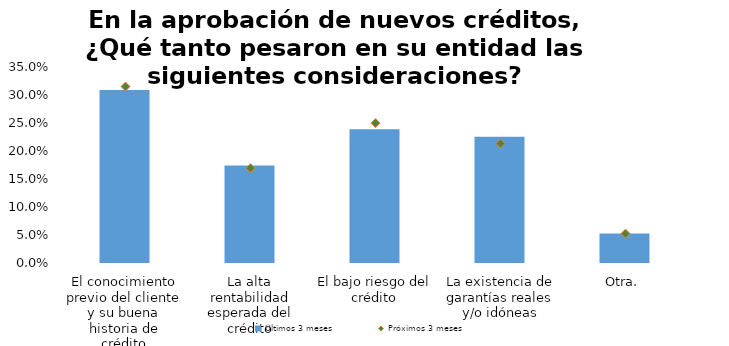
| Category | Últimos 3 meses |
|---|---|
| El conocimiento previo del cliente y su buena historia de crédito | 0.309 |
| La alta rentabilidad esperada del crédito | 0.174 |
| El bajo riesgo del crédito | 0.239 |
| La existencia de garantías reales y/o idóneas | 0.225 |
| Otra. | 0.053 |